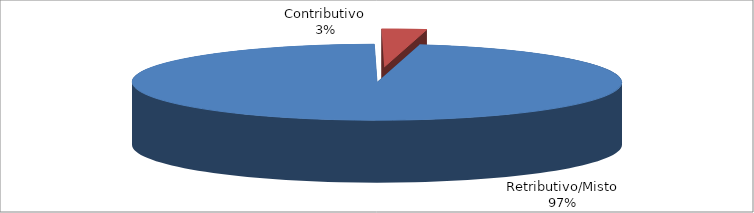
| Category | Series 1 |
|---|---|
| Retributivo/Misto | 92419 |
| Contributivo | 2815 |